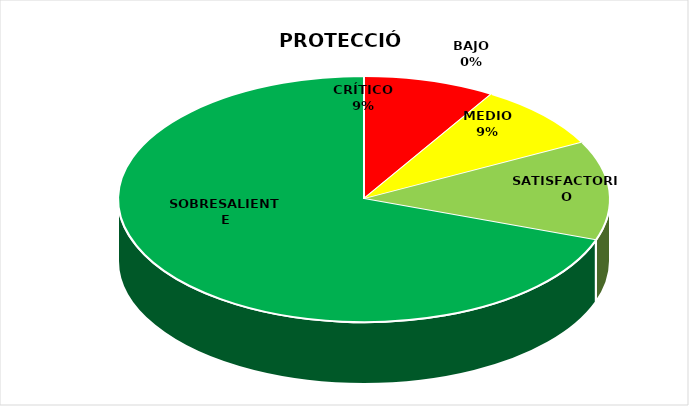
| Category | Series 0 |
|---|---|
| CRÍTICO | 2 |
| BAJO | 0 |
| MEDIO | 2 |
| SATISFACTORIO | 3 |
| SOBRESALIENTE | 16 |